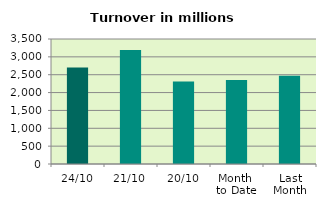
| Category | Series 0 |
|---|---|
| 24/10 | 2701.449 |
| 21/10 | 3192.124 |
| 20/10 | 2309.564 |
| Month 
to Date | 2350.209 |
| Last
Month | 2468.023 |